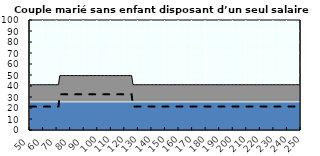
| Category | Coin fiscal marginal (somme des composantes) | Taux d’imposition marginal net |
|---|---|---|
| 50.0 | 41.166 | 21.28 |
| 51.0 | 41.166 | 21.28 |
| 52.0 | 41.166 | 21.28 |
| 53.0 | 41.166 | 21.28 |
| 54.0 | 41.166 | 21.28 |
| 55.0 | 41.166 | 21.28 |
| 56.0 | 41.166 | 21.28 |
| 57.0 | 41.166 | 21.28 |
| 58.0 | 41.166 | 21.28 |
| 59.0 | 41.166 | 21.28 |
| 60.0 | 41.166 | 21.28 |
| 61.0 | 41.166 | 21.28 |
| 62.0 | 41.166 | 21.28 |
| 63.0 | 41.166 | 21.28 |
| 64.0 | 41.166 | 21.28 |
| 65.0 | 41.166 | 21.28 |
| 66.0 | 41.166 | 21.28 |
| 67.0 | 41.166 | 21.28 |
| 68.0 | 41.166 | 21.28 |
| 69.0 | 41.166 | 21.28 |
| 70.0 | 41.166 | 21.28 |
| 71.0 | 41.166 | 21.28 |
| 72.0 | 49.358 | 32.24 |
| 73.0 | 49.47 | 32.391 |
| 74.0 | 49.47 | 32.391 |
| 75.0 | 49.47 | 32.391 |
| 76.0 | 49.47 | 32.391 |
| 77.0 | 49.47 | 32.391 |
| 78.0 | 49.47 | 32.391 |
| 79.0 | 49.47 | 32.391 |
| 80.0 | 49.47 | 32.391 |
| 81.0 | 49.47 | 32.391 |
| 82.0 | 49.47 | 32.391 |
| 83.0 | 49.47 | 32.391 |
| 84.0 | 49.47 | 32.391 |
| 85.0 | 49.47 | 32.391 |
| 86.0 | 49.47 | 32.391 |
| 87.0 | 49.47 | 32.391 |
| 88.0 | 49.47 | 32.391 |
| 89.0 | 49.47 | 32.391 |
| 90.0 | 49.47 | 32.391 |
| 91.0 | 49.47 | 32.391 |
| 92.0 | 49.47 | 32.391 |
| 93.0 | 49.47 | 32.391 |
| 94.0 | 49.47 | 32.391 |
| 95.0 | 49.47 | 32.391 |
| 96.0 | 49.47 | 32.391 |
| 97.0 | 49.47 | 32.391 |
| 98.0 | 49.47 | 32.391 |
| 99.0 | 49.47 | 32.391 |
| 100.0 | 49.47 | 32.391 |
| 101.0 | 49.47 | 32.391 |
| 102.0 | 49.47 | 32.391 |
| 103.0 | 49.47 | 32.391 |
| 104.0 | 49.47 | 32.391 |
| 105.0 | 49.47 | 32.391 |
| 106.0 | 49.47 | 32.391 |
| 107.0 | 49.47 | 32.391 |
| 108.0 | 49.47 | 32.391 |
| 109.0 | 49.47 | 32.391 |
| 110.0 | 49.47 | 32.391 |
| 111.0 | 49.47 | 32.391 |
| 112.0 | 49.47 | 32.391 |
| 113.0 | 49.47 | 32.391 |
| 114.0 | 49.47 | 32.391 |
| 115.0 | 49.47 | 32.391 |
| 116.0 | 49.47 | 32.391 |
| 117.0 | 49.47 | 32.391 |
| 118.0 | 49.47 | 32.391 |
| 119.0 | 49.47 | 32.391 |
| 120.0 | 49.47 | 32.391 |
| 121.0 | 49.47 | 32.391 |
| 122.0 | 49.47 | 32.391 |
| 123.0 | 49.47 | 32.391 |
| 124.0 | 49.47 | 32.391 |
| 125.0 | 49.47 | 32.391 |
| 126.0 | 41.363 | 21.544 |
| 127.0 | 41.166 | 21.28 |
| 128.0 | 41.166 | 21.28 |
| 129.0 | 41.166 | 21.28 |
| 130.0 | 41.166 | 21.28 |
| 131.0 | 41.166 | 21.28 |
| 132.0 | 41.166 | 21.28 |
| 133.0 | 41.166 | 21.28 |
| 134.0 | 41.166 | 21.28 |
| 135.0 | 41.166 | 21.28 |
| 136.0 | 41.166 | 21.28 |
| 137.0 | 41.166 | 21.28 |
| 138.0 | 41.166 | 21.28 |
| 139.0 | 41.166 | 21.28 |
| 140.0 | 41.166 | 21.28 |
| 141.0 | 41.166 | 21.28 |
| 142.0 | 41.166 | 21.28 |
| 143.0 | 41.166 | 21.28 |
| 144.0 | 41.166 | 21.28 |
| 145.0 | 41.166 | 21.28 |
| 146.0 | 41.166 | 21.28 |
| 147.0 | 41.166 | 21.28 |
| 148.0 | 41.166 | 21.28 |
| 149.0 | 41.166 | 21.28 |
| 150.0 | 41.166 | 21.28 |
| 151.0 | 41.166 | 21.28 |
| 152.0 | 41.166 | 21.28 |
| 153.0 | 41.166 | 21.28 |
| 154.0 | 41.166 | 21.28 |
| 155.0 | 41.166 | 21.28 |
| 156.0 | 41.166 | 21.28 |
| 157.0 | 41.166 | 21.28 |
| 158.0 | 41.166 | 21.28 |
| 159.0 | 41.166 | 21.28 |
| 160.0 | 41.166 | 21.28 |
| 161.0 | 41.166 | 21.28 |
| 162.0 | 41.166 | 21.28 |
| 163.0 | 41.166 | 21.28 |
| 164.0 | 41.166 | 21.28 |
| 165.0 | 41.166 | 21.28 |
| 166.0 | 41.166 | 21.28 |
| 167.0 | 41.166 | 21.28 |
| 168.0 | 41.166 | 21.28 |
| 169.0 | 41.166 | 21.28 |
| 170.0 | 41.166 | 21.28 |
| 171.0 | 41.166 | 21.28 |
| 172.0 | 41.166 | 21.28 |
| 173.0 | 41.166 | 21.28 |
| 174.0 | 41.166 | 21.28 |
| 175.0 | 41.166 | 21.28 |
| 176.0 | 41.166 | 21.28 |
| 177.0 | 41.166 | 21.28 |
| 178.0 | 41.166 | 21.28 |
| 179.0 | 41.166 | 21.28 |
| 180.0 | 41.166 | 21.28 |
| 181.0 | 41.166 | 21.28 |
| 182.0 | 41.166 | 21.28 |
| 183.0 | 41.166 | 21.28 |
| 184.0 | 41.166 | 21.28 |
| 185.0 | 41.166 | 21.28 |
| 186.0 | 41.166 | 21.28 |
| 187.0 | 41.166 | 21.28 |
| 188.0 | 41.166 | 21.28 |
| 189.0 | 41.166 | 21.28 |
| 190.0 | 41.166 | 21.28 |
| 191.0 | 41.166 | 21.28 |
| 192.0 | 41.166 | 21.28 |
| 193.0 | 41.166 | 21.28 |
| 194.0 | 41.166 | 21.28 |
| 195.0 | 41.166 | 21.28 |
| 196.0 | 41.166 | 21.28 |
| 197.0 | 41.166 | 21.28 |
| 198.0 | 41.166 | 21.28 |
| 199.0 | 41.166 | 21.28 |
| 200.0 | 41.166 | 21.28 |
| 201.0 | 41.166 | 21.28 |
| 202.0 | 41.166 | 21.28 |
| 203.0 | 41.166 | 21.28 |
| 204.0 | 41.166 | 21.28 |
| 205.0 | 41.166 | 21.28 |
| 206.0 | 41.166 | 21.28 |
| 207.0 | 41.166 | 21.28 |
| 208.0 | 41.166 | 21.28 |
| 209.0 | 41.166 | 21.28 |
| 210.0 | 41.166 | 21.28 |
| 211.0 | 41.166 | 21.28 |
| 212.0 | 41.166 | 21.28 |
| 213.0 | 41.166 | 21.28 |
| 214.0 | 41.166 | 21.28 |
| 215.0 | 41.166 | 21.28 |
| 216.0 | 41.166 | 21.28 |
| 217.0 | 41.166 | 21.28 |
| 218.0 | 41.166 | 21.28 |
| 219.0 | 41.166 | 21.28 |
| 220.0 | 41.166 | 21.28 |
| 221.0 | 41.166 | 21.28 |
| 222.0 | 41.166 | 21.28 |
| 223.0 | 41.166 | 21.28 |
| 224.0 | 41.166 | 21.28 |
| 225.0 | 41.166 | 21.28 |
| 226.0 | 41.166 | 21.28 |
| 227.0 | 41.166 | 21.28 |
| 228.0 | 41.166 | 21.28 |
| 229.0 | 41.166 | 21.28 |
| 230.0 | 41.166 | 21.28 |
| 231.0 | 41.166 | 21.28 |
| 232.0 | 41.166 | 21.28 |
| 233.0 | 41.166 | 21.28 |
| 234.0 | 41.166 | 21.28 |
| 235.0 | 41.166 | 21.28 |
| 236.0 | 41.166 | 21.28 |
| 237.0 | 41.166 | 21.28 |
| 238.0 | 41.166 | 21.28 |
| 239.0 | 41.166 | 21.28 |
| 240.0 | 41.166 | 21.28 |
| 241.0 | 41.166 | 21.28 |
| 242.0 | 41.166 | 21.28 |
| 243.0 | 41.166 | 21.28 |
| 244.0 | 41.166 | 21.28 |
| 245.0 | 41.166 | 21.28 |
| 246.0 | 41.166 | 21.28 |
| 247.0 | 41.166 | 21.28 |
| 248.0 | 41.166 | 21.28 |
| 249.0 | 41.166 | 21.28 |
| 250.0 | 41.166 | 21.28 |